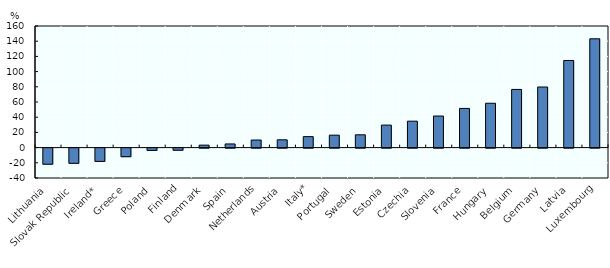
| Category | Missing/actual |
|---|---|
| Lithuania | -21.195 |
| Slovak Republic | -19.997 |
| Ireland* | -17.505 |
| Greece | -11.313 |
| Poland | -3.01 |
| Finland | -2.79 |
| Denmark | 3.255 |
| Spain | 4.802 |
| Netherlands | 9.974 |
| Austria | 10.232 |
| Italy* | 14.429 |
| Portugal | 16.361 |
| Sweden | 16.839 |
| Estonia | 29.608 |
| Czechia | 34.762 |
| Slovenia | 41.547 |
| France | 51.534 |
| Hungary | 58.35 |
| Belgium | 76.535 |
| Germany | 79.718 |
| Latvia | 114.622 |
| Luxembourg | 143.175 |